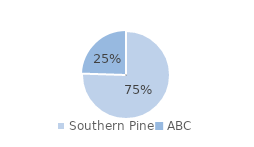
| Category | Series 0 |
|---|---|
| Southern Pine | 0.924 |
| ABC | 0.3 |